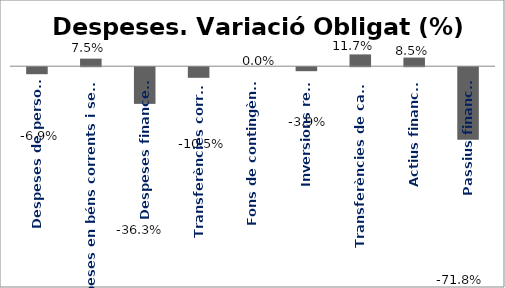
| Category | Series 0 |
|---|---|
| Despeses de personal | -0.069 |
| Despeses en béns corrents i serveis | 0.075 |
| Despeses financeres | -0.363 |
| Transferències corrents | -0.105 |
| Fons de contingència | 0 |
| Inversions reals | -0.039 |
| Transferències de capital | 0.117 |
| Actius financers | 0.085 |
| Passius financers | -0.718 |